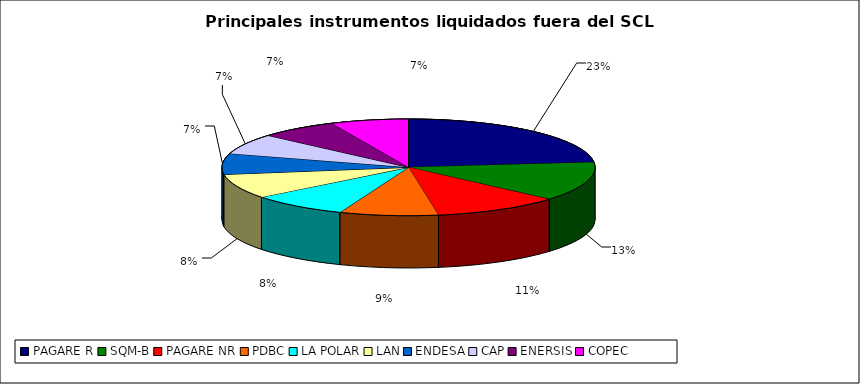
| Category | Series 0 |
|---|---|
| PAGARE R | 2149 |
| SQM-B | 1205 |
| PAGARE NR | 1015 |
| PDBC | 787 |
| LA POLAR | 780 |
| LAN | 756 |
| ENDESA | 644 |
| CAP | 626 |
| ENERSIS | 626 |
| COPEC | 622 |